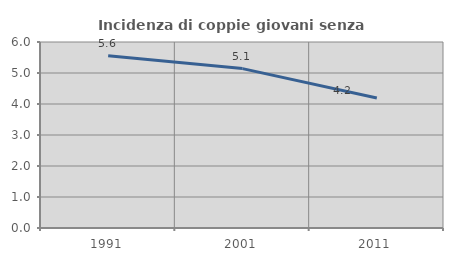
| Category | Incidenza di coppie giovani senza figli |
|---|---|
| 1991.0 | 5.556 |
| 2001.0 | 5.141 |
| 2011.0 | 4.196 |